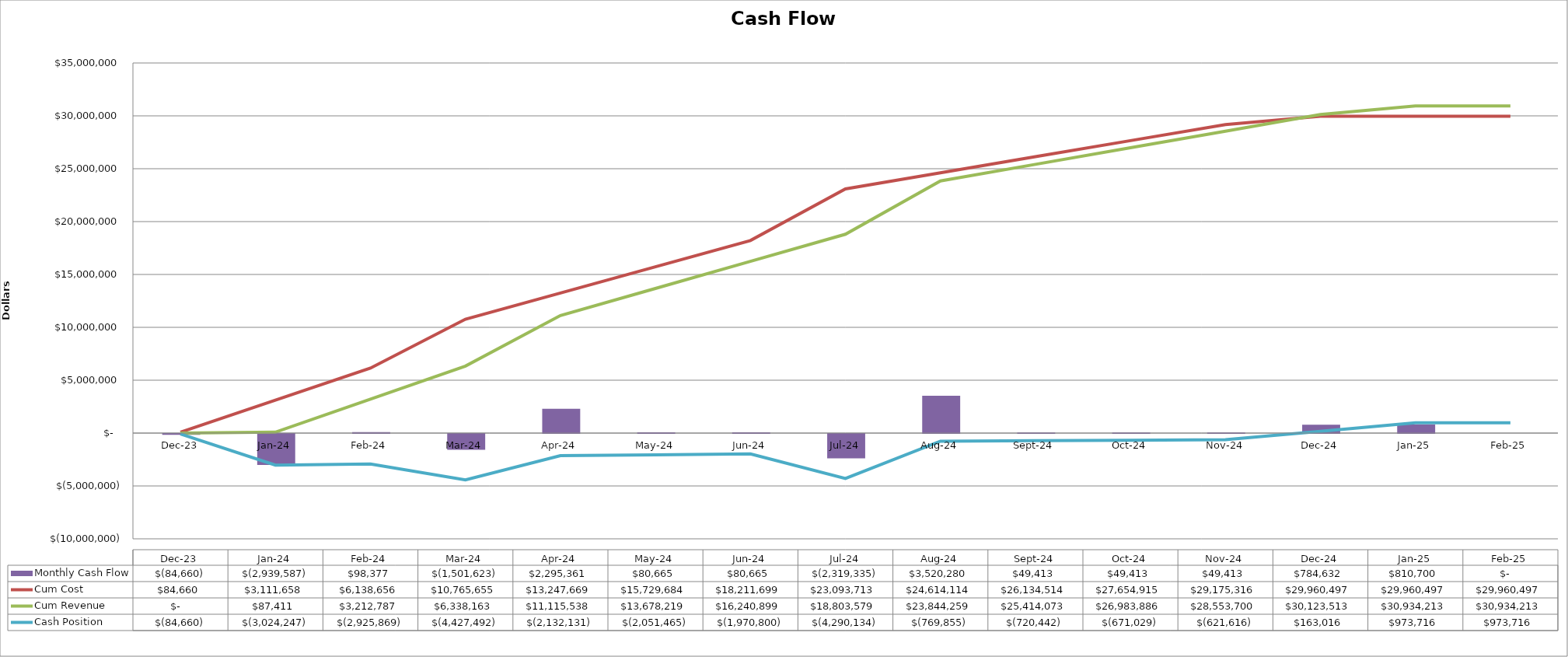
| Category | Monthly Cash Flow |
|---|---|
| 2023-12-15 | -84659.917 |
| 2024-01-15 | -2939586.89 |
| 2024-02-15 | 98377.443 |
| 2024-03-17 | -1501622.557 |
| 2024-04-17 | 2295361.059 |
| 2024-05-18 | 80665.476 |
| 2024-06-18 | 80665.476 |
| 2024-07-19 | -2319334.524 |
| 2024-08-19 | 3520279.519 |
| 2024-09-19 | 49413.019 |
| 2024-10-20 | 49413.019 |
| 2024-11-20 | 49413.019 |
| 2024-12-21 | 784632.224 |
| 2025-01-21 | 810699.785 |
| 2025-02-21 | 0 |